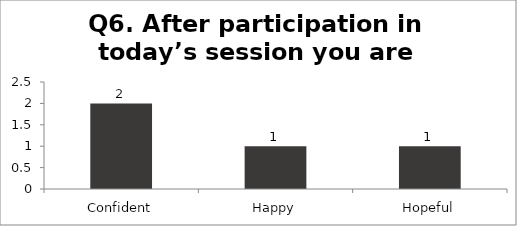
| Category | Q6. After participation in today’s session you are feeling? |
|---|---|
| Confident | 2 |
| Happy | 1 |
| Hopeful | 1 |